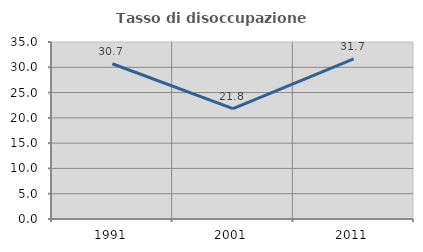
| Category | Tasso di disoccupazione giovanile  |
|---|---|
| 1991.0 | 30.693 |
| 2001.0 | 21.818 |
| 2011.0 | 31.667 |